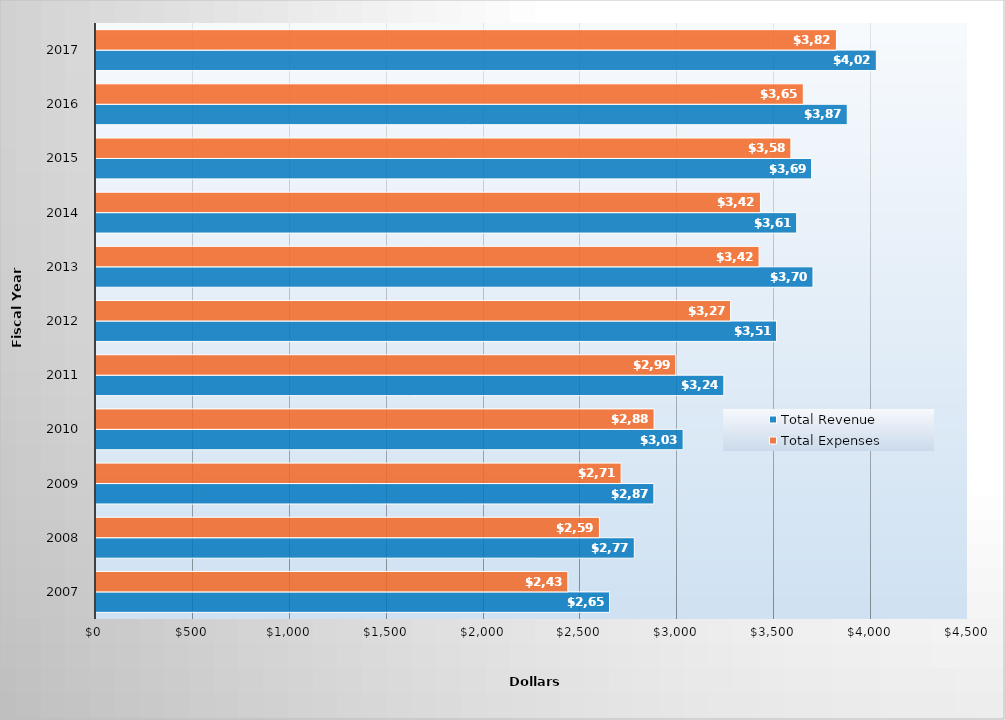
| Category | Total Revenue | Total Expenses |
|---|---|---|
| 2007.0 | 2650 | 2435 |
| 2008.0 | 2778 | 2598 |
| 2009.0 | 2879 | 2710 |
| 2010.0 | 3030 | 2880 |
| 2011.0 | 3240 | 2992 |
| 2012.0 | 3512 | 3275 |
| 2013.0 | 3700 | 3422 |
| 2014.0 | 3616 | 3429 |
| 2015.0 | 3693 | 3586 |
| 2016.0 | 3877 | 3650 |
| 2017.0 | 4027 | 3821 |